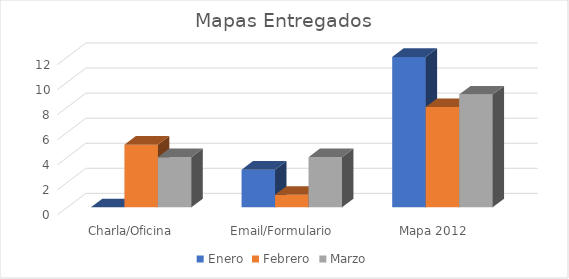
| Category | Enero | Febrero | Marzo |
|---|---|---|---|
| Charla/Oficina | 0 | 5 | 4 |
| Email/Formulario | 3 | 1 | 4 |
| Mapa 2012 | 12 | 8 | 9 |